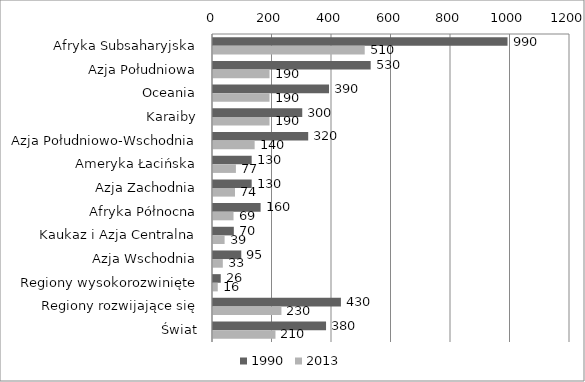
| Category | 1990 | 2013 |
|---|---|---|
| Afryka Subsaharyjska | 990 | 510 |
| Azja Południowa | 530 | 190 |
| Oceania | 390 | 190 |
| Karaiby | 300 | 190 |
| Azja Południowo-Wschodnia | 320 | 140 |
| Ameryka Łacińska | 130 | 77 |
| Azja Zachodnia | 130 | 74 |
| Afryka Północna | 160 | 69 |
| Kaukaz i Azja Centralna | 70 | 39 |
| Azja Wschodnia | 95 | 33 |
| Regiony wysokorozwinięte | 26 | 16 |
| Regiony rozwijające się | 430 | 230 |
| Świat | 380 | 210 |